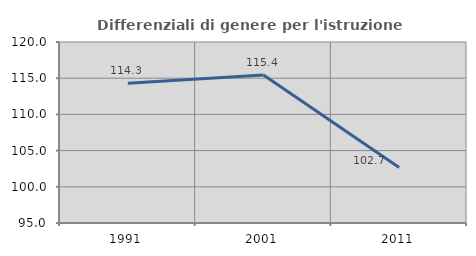
| Category | Differenziali di genere per l'istruzione superiore |
|---|---|
| 1991.0 | 114.318 |
| 2001.0 | 115.436 |
| 2011.0 | 102.658 |